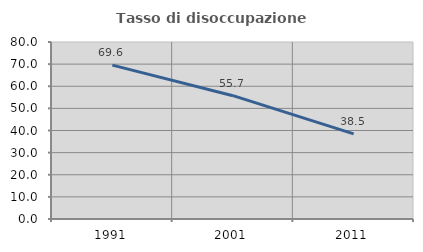
| Category | Tasso di disoccupazione giovanile  |
|---|---|
| 1991.0 | 69.565 |
| 2001.0 | 55.738 |
| 2011.0 | 38.462 |